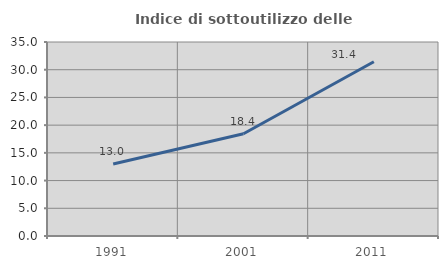
| Category | Indice di sottoutilizzo delle abitazioni  |
|---|---|
| 1991.0 | 12.998 |
| 2001.0 | 18.449 |
| 2011.0 | 31.44 |